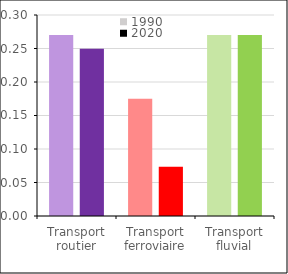
| Category | 1990 | 2020 |
|---|---|---|
| Transport routier | 0.27 | 0.25 |
| Transport ferroviaire | 0.175 | 0.074 |
| Transport fluvial | 0.27 | 0.27 |